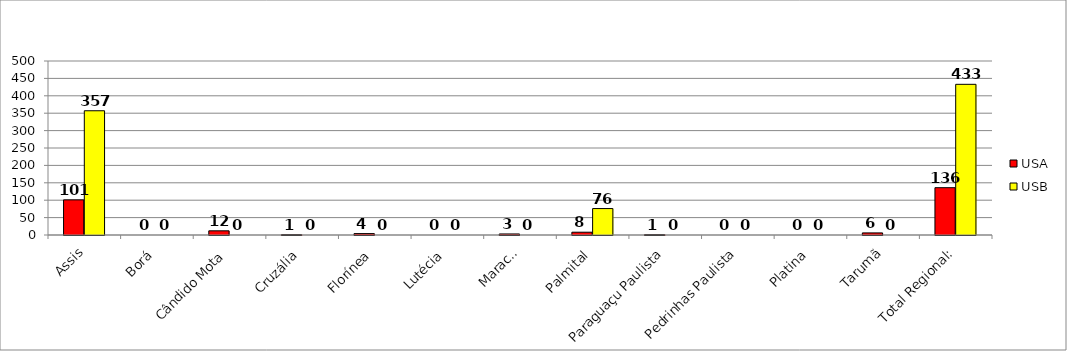
| Category | USA | USB |
|---|---|---|
| Assis | 101 | 357 |
| Borá | 0 | 0 |
| Cândido Mota | 12 | 0 |
| Cruzália | 1 | 0 |
| Florínea | 4 | 0 |
| Lutécia | 0 | 0 |
| Maracaí | 3 | 0 |
| Palmital | 8 | 76 |
| Paraguaçu Paulista | 1 | 0 |
| Pedrinhas Paulista | 0 | 0 |
| Platina | 0 | 0 |
| Tarumã | 6 | 0 |
| Total Regional: | 136 | 433 |